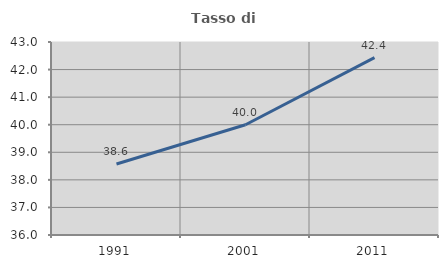
| Category | Tasso di occupazione   |
|---|---|
| 1991.0 | 38.575 |
| 2001.0 | 40 |
| 2011.0 | 42.435 |